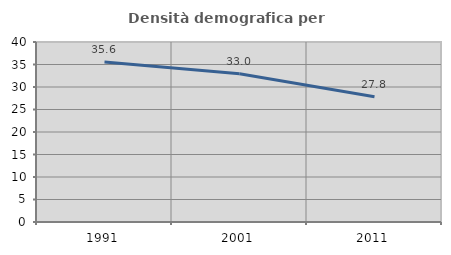
| Category | Densità demografica |
|---|---|
| 1991.0 | 35.58 |
| 2001.0 | 32.953 |
| 2011.0 | 27.826 |